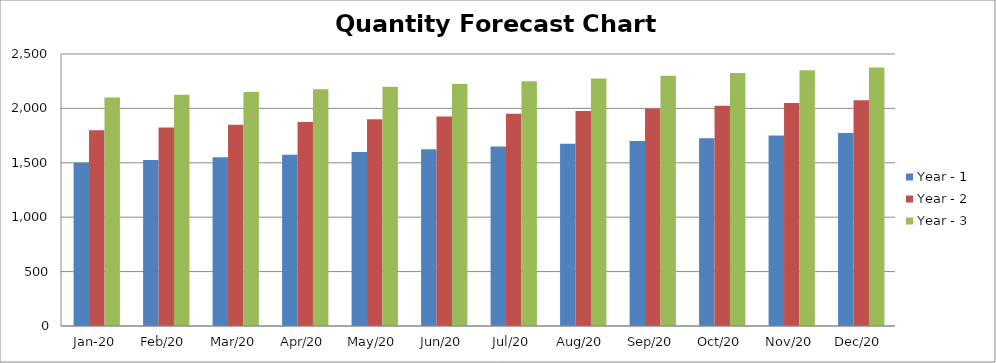
| Category | Year - 1 | Year - 2 | Year - 3 |
|---|---|---|---|
| 2020-01-01 | 1500 | 1800 | 2100 |
| 2020-02-01 | 1525 | 1825 | 2125 |
| 2020-03-01 | 1550 | 1850 | 2150 |
| 2020-04-01 | 1575 | 1875 | 2175 |
| 2020-05-01 | 1600 | 1900 | 2200 |
| 2020-06-01 | 1625 | 1925 | 2225 |
| 2020-07-01 | 1650 | 1950 | 2250 |
| 2020-08-01 | 1675 | 1975 | 2275 |
| 2020-09-01 | 1700 | 2000 | 2300 |
| 2020-10-01 | 1725 | 2025 | 2325 |
| 2020-11-01 | 1750 | 2050 | 2350 |
| 2020-12-01 | 1775 | 2075 | 2375 |